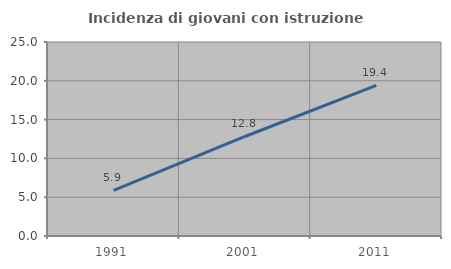
| Category | Incidenza di giovani con istruzione universitaria |
|---|---|
| 1991.0 | 5.882 |
| 2001.0 | 12.825 |
| 2011.0 | 19.407 |